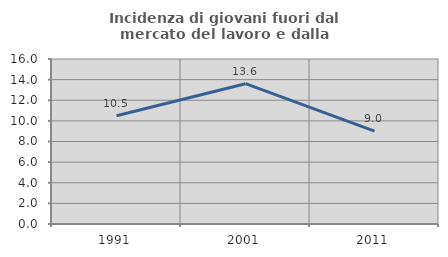
| Category | Incidenza di giovani fuori dal mercato del lavoro e dalla formazione  |
|---|---|
| 1991.0 | 10.5 |
| 2001.0 | 13.605 |
| 2011.0 | 9.009 |